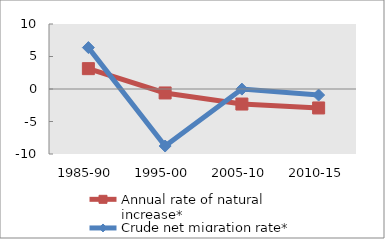
| Category | Annual rate of natural increase* | Crude net migration rate* |
|---|---|---|
| 1985-90 | 3.132 | 6.371 |
| 1995-00 | -0.61 | -8.772 |
| 2005-10 | -2.314 | -0.016 |
| 2010-15 | -2.916 | -0.931 |